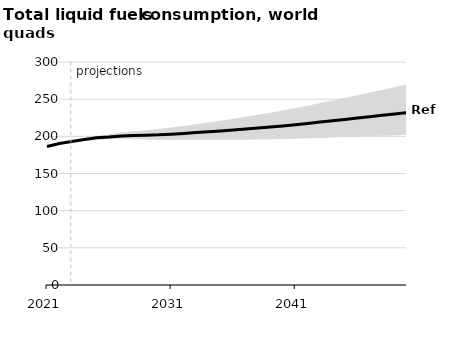
| Category | Reference |
|---|---|
| 0 | 186.348 |
| 1 | 190.378 |
| 2 | 193.173 |
| 3 | 195.642 |
| 4 | 198.158 |
| 5 | 199.096 |
| 6 | 200.497 |
| 7 | 201.074 |
| 8 | 201.59 |
| 9 | 202.013 |
| 10 | 202.904 |
| 11 | 203.949 |
| 12 | 205.017 |
| 13 | 206.175 |
| 14 | 207.281 |
| 15 | 208.526 |
| 16 | 209.826 |
| 17 | 211.149 |
| 18 | 212.508 |
| 19 | 213.996 |
| 20 | 215.641 |
| 21 | 217.376 |
| 22 | 219.14 |
| 23 | 220.956 |
| 24 | 222.767 |
| 25 | 224.611 |
| 26 | 226.47 |
| 27 | 228.241 |
| 28 | 230.011 |
| 29 | 231.864 |